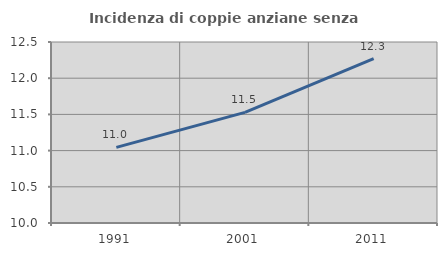
| Category | Incidenza di coppie anziane senza figli  |
|---|---|
| 1991.0 | 11.045 |
| 2001.0 | 11.527 |
| 2011.0 | 12.272 |